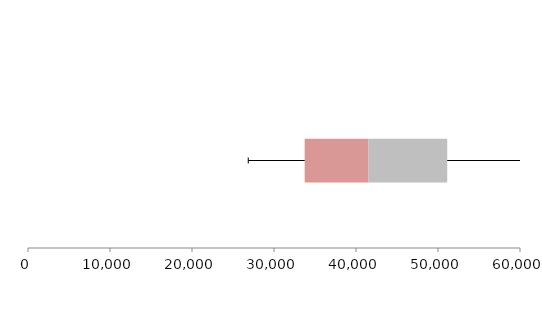
| Category | Series 1 | Series 2 | Series 3 |
|---|---|---|---|
| 0 | 33741.056 | 7790.202 | 9592.43 |